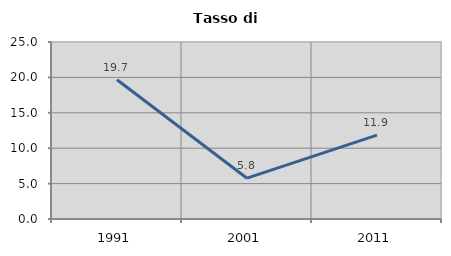
| Category | Tasso di disoccupazione   |
|---|---|
| 1991.0 | 19.669 |
| 2001.0 | 5.765 |
| 2011.0 | 11.853 |